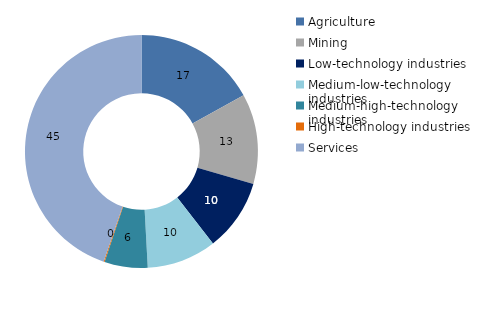
| Category | 2014 |
|---|---|
| Agriculture | 16.99 |
| Mining | 12.508 |
| Low-technology industries | 9.992 |
| Medium-low-technology industries | 9.653 |
| Medium-high-technology industries | 5.995 |
| High-technology industries | 0.136 |
| Services | 44.725 |